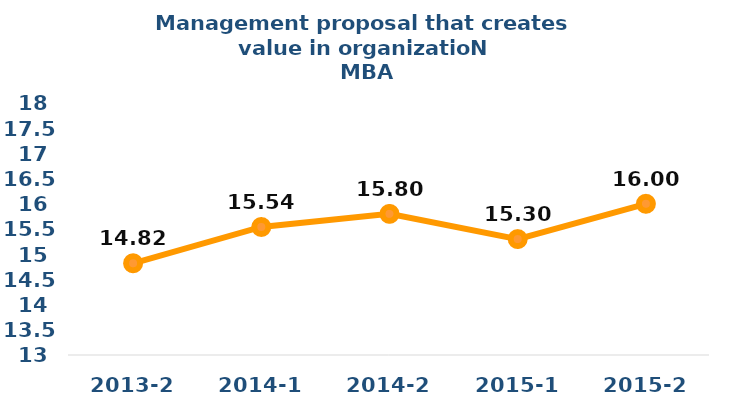
| Category | Series 0 |
|---|---|
| 2013-2 | 14.82 |
| 2014-1 | 15.54 |
| 2014-2 | 15.8 |
| 2015-1 | 15.3 |
| 2015-2 | 16 |